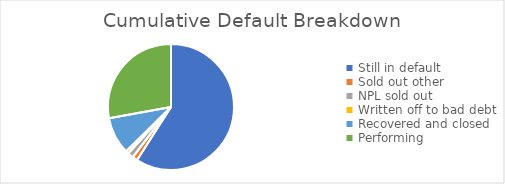
| Category | Cumulative Default Breakdown |
|---|---|
| Still in default | 0.591 |
| Sold out other | 0.013 |
| NPL sold out | 0.015 |
| Written off to bad debt | 0.007 |
| Recovered and closed | 0.095 |
| Performing | 0.279 |